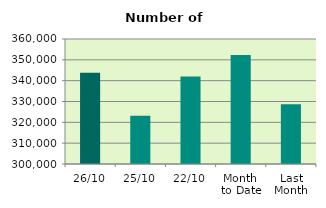
| Category | Series 0 |
|---|---|
| 26/10 | 343784 |
| 25/10 | 323134 |
| 22/10 | 342032 |
| Month 
to Date | 352300.667 |
| Last
Month | 328669.364 |